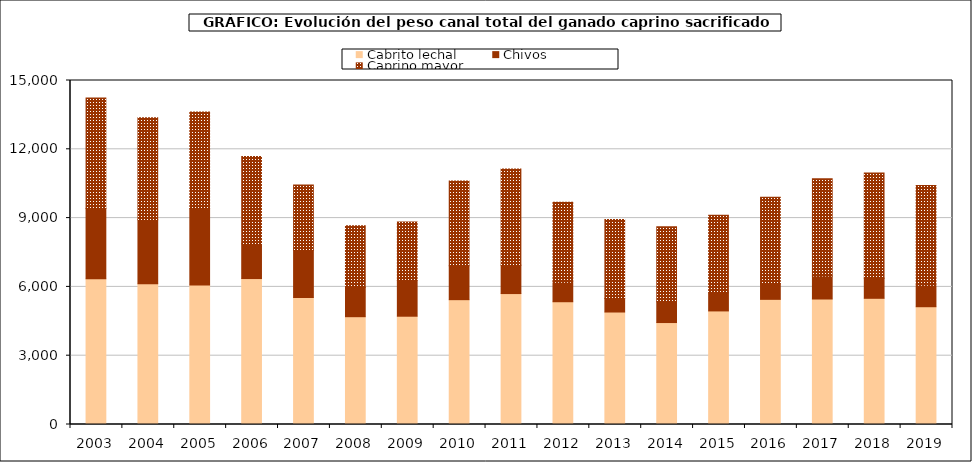
| Category | Cabrito lechal | Chivos | Caprino mayor |
|---|---|---|---|
| 2003.0 | 6354.4 | 3060.7 | 4824.6 |
| 2004.0 | 6133.147 | 2794.229 | 4446.039 |
| 2005.0 | 6081.5 | 3326.197 | 4213.791 |
| 2006.0 | 6363.804 | 1514.071 | 3812.237 |
| 2007.0 | 5538.187 | 2055.519 | 2852.212 |
| 2008.0 | 4700.787 | 1279.039 | 2682.444 |
| 2009.0 | 4721.591 | 1569.493 | 2539.825 |
| 2010.0 | 5443.269 | 1481.101 | 3693.873 |
| 2011.0 | 5709.183 | 1237.105 | 4195.759 |
| 2012.0 | 5353.402 | 854.156 | 3488.702 |
| 2013.0 | 4904.881 | 592.234 | 3442.821 |
| 2014.0 | 4445.773 | 905.526 | 3270.219 |
| 2015.0 | 4952.564 | 787.441 | 3379.656 |
| 2016.0 | 5457.161 | 675.571 | 3771.302 |
| 2017.0 | 5472.065 | 1000.592 | 4240.75 |
| 2018.0 | 5503.007 | 875.093 | 4592.59 |
| 2019.0 | 5135.593 | 934.336 | 4349.983 |